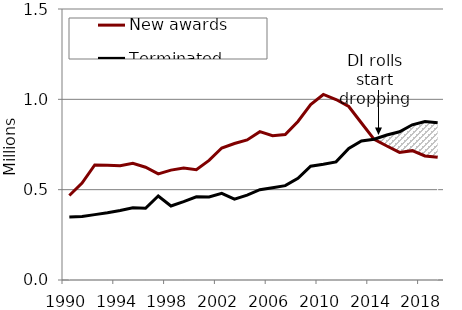
| Category | New awards | Terminated beneficiaries |
|---|---|---|
| 1990.0 | 0.468 | 0.348 |
| 1991.0 | 0.536 | 0.351 |
| 1992.0 | 0.637 | 0.362 |
| 1993.0 | 0.635 | 0.372 |
| 1994.0 | 0.632 | 0.385 |
| 1995.0 | 0.646 | 0.399 |
| 1996.0 | 0.624 | 0.397 |
| 1997.0 | 0.587 | 0.465 |
| 1998.0 | 0.608 | 0.409 |
| 1999.0 | 0.62 | 0.434 |
| 2000.0 | 0.611 | 0.46 |
| 2001.0 | 0.662 | 0.459 |
| 2002.0 | 0.73 | 0.479 |
| 2003.0 | 0.756 | 0.447 |
| 2004.0 | 0.775 | 0.47 |
| 2005.0 | 0.821 | 0.5 |
| 2006.0 | 0.799 | 0.511 |
| 2007.0 | 0.805 | 0.522 |
| 2008.0 | 0.877 | 0.563 |
| 2009.0 | 0.971 | 0.63 |
| 2010.0 | 1.027 | 0.641 |
| 2011.0 | 0.999 | 0.654 |
| 2012.0 | 0.96 | 0.728 |
| 2013.0 | 0.869 | 0.769 |
| 2014.0 | 0.779 | 0.779 |
| 2015.0 | 0.741 | 0.803 |
| 2016.0 | 0.706 | 0.82 |
| 2017.0 | 0.716 | 0.859 |
| 2018.0 | 0.687 | 0.877 |
| 2019.0 | 0.679 | 0.871 |